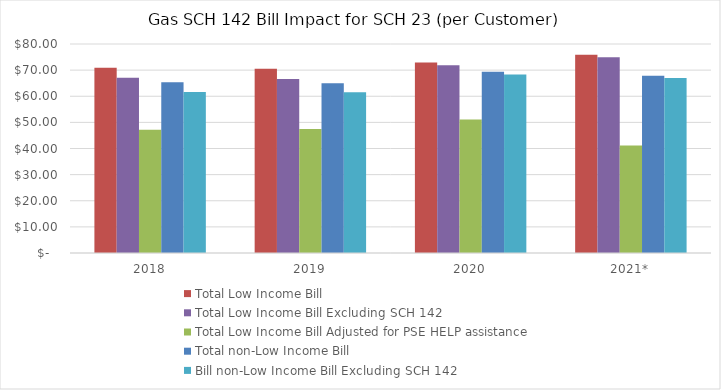
| Category | Total Low Income Bill  | Total Low Income Bill Excluding SCH 142 | Total Low Income Bill Adjusted for PSE HELP assistance  | Total non-Low Income Bill  | Bill non-Low Income Bill Excluding SCH 142 |
|---|---|---|---|---|---|
| 2018 | 70.953 | 67.08 | 47.187 | 65.323 | 61.639 |
| 2019 | 70.537 | 66.627 | 47.482 | 64.944 | 61.488 |
| 2020 | 72.932 | 71.851 | 51.136 | 69.374 | 68.365 |
| 2021* | 75.848 | 74.901 | 41.122 | 67.857 | 66.976 |